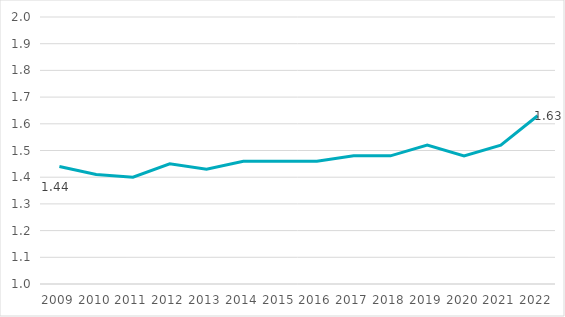
| Category | Series 0 |
|---|---|
| 2009.0 | 1.44 |
| 2010.0 | 1.41 |
| 2011.0 | 1.4 |
| 2012.0 | 1.45 |
| 2013.0 | 1.43 |
| 2014.0 | 1.46 |
| 2015.0 | 1.46 |
| 2016.0 | 1.46 |
| 2017.0 | 1.48 |
| 2018.0 | 1.48 |
| 2019.0 | 1.52 |
| 2020.0 | 1.48 |
| 2021.0 | 1.52 |
| 2022.0 | 1.63 |